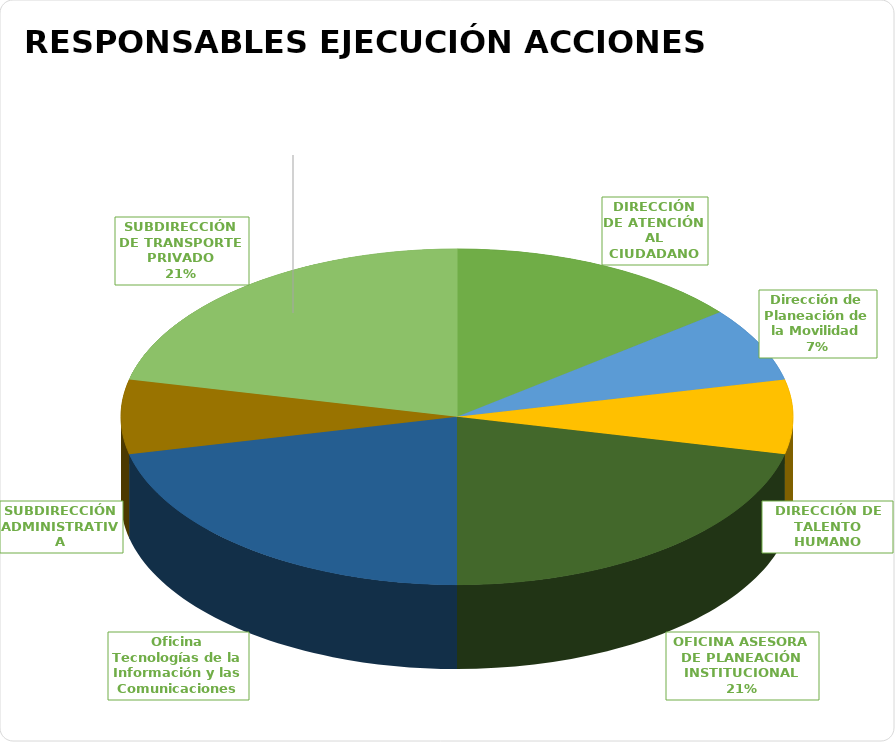
| Category | Total |
|---|---|
| DIRECCIÓN DE ATENCIÓN AL CIUDADANO | 2 |
| Dirección de Planeación de la Movilidad | 1 |
| DIRECCIÓN DE TALENTO HUMANO | 1 |
| OFICINA ASESORA DE PLANEACIÓN INSTITUCIONAL | 3 |
| Oficina Tecnologías de la Información y las Comunicaciones | 3 |
| SUBDIRECCIÓN ADMINISTRATIVA | 1 |
| SUBDIRECCIÓN DE TRANSPORTE PRIVADO | 3 |